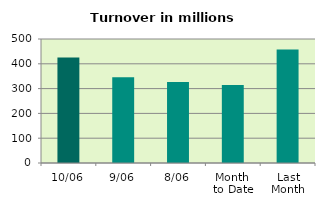
| Category | Series 0 |
|---|---|
| 10/06 | 425.657 |
| 9/06 | 345.951 |
| 8/06 | 326.573 |
| Month 
to Date | 314.942 |
| Last
Month | 457.674 |